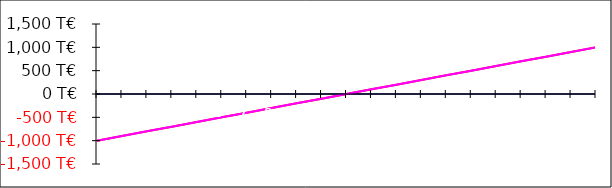
| Category | Revenue | Fixed Expenses | Variable Expenses | Total Expenses | Profit or Loss |
|---|---|---|---|---|---|
| 0 | -1000 | 0 | 0 | 0 | -1000 |
| 1 | -900 | 0 | 0 | 0 | -900 |
| 2 | -800 | 0 | 0 | 0 | -800 |
| 3 | -700 | 0 | 0 | 0 | -700 |
| 4 | -600 | 0 | 0 | 0 | -600 |
| 5 | -500 | 0 | 0 | 0 | -500 |
| 6 | -400 | 0 | 0 | 0 | -400 |
| 7 | -300 | 0 | 0 | 0 | -300 |
| 8 | -200 | 0 | 0 | 0 | -200 |
| 9 | -100 | 0 | 0 | 0 | -100 |
| 10 | 0 | 0 | 0 | 0 | 0 |
| 11 | 100 | 0 | 0 | 0 | 100 |
| 12 | 200 | 0 | 0 | 0 | 200 |
| 13 | 300 | 0 | 0 | 0 | 300 |
| 14 | 400 | 0 | 0 | 0 | 400 |
| 15 | 500 | 0 | 0 | 0 | 500 |
| 16 | 600 | 0 | 0 | 0 | 600 |
| 17 | 700 | 0 | 0 | 0 | 700 |
| 18 | 800 | 0 | 0 | 0 | 800 |
| 19 | 900 | 0 | 0 | 0 | 900 |
| 20 | 1000 | 0 | 0 | 0 | 1000 |